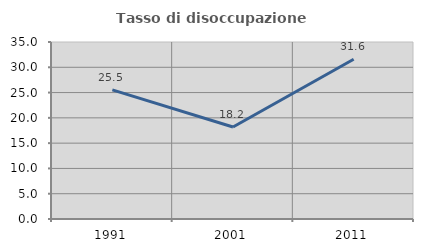
| Category | Tasso di disoccupazione giovanile  |
|---|---|
| 1991.0 | 25.532 |
| 2001.0 | 18.182 |
| 2011.0 | 31.579 |